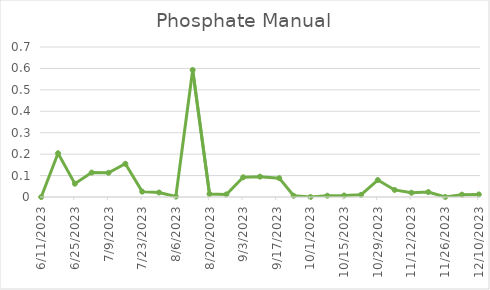
| Category | Series 0 |
|---|---|
| 6/11/23 | 0 |
| 6/18/23 | 0.204 |
| 6/25/23 | 0.062 |
| 7/2/23 | 0.114 |
| 7/9/23 | 0.113 |
| 7/16/23 | 0.155 |
| 7/23/23 | 0.025 |
| 7/30/23 | 0.021 |
| 8/6/23 | 0.002 |
| 8/13/23 | 0.593 |
| 8/20/23 | 0.014 |
| 8/27/23 | 0.012 |
| 9/3/23 | 0.092 |
| 9/10/23 | 0.095 |
| 9/18/23 | 0.088 |
| 9/24/23 | 0.006 |
| 10/1/23 | 0 |
| 10/8/23 | 0.006 |
| 10/15/23 | 0.007 |
| 10/22/23 | 0.01 |
| 10/29/23 | 0.079 |
| 11/5/23 | 0.033 |
| 11/12/23 | 0.02 |
| 11/19/23 | 0.023 |
| 11/26/23 | 0 |
| 12/3/23 | 0.011 |
| 12/10/23 | 0.012 |